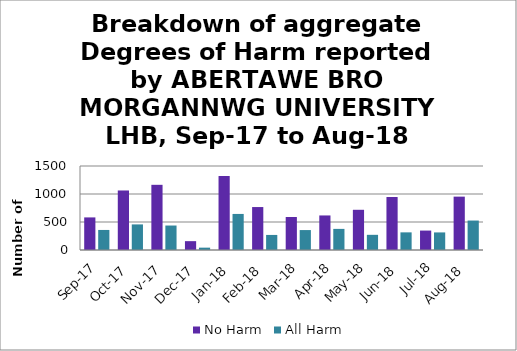
| Category | No Harm | All Harm |
|---|---|---|
| Sep-17 | 582 | 358 |
| Oct-17 | 1063 | 457 |
| Nov-17 | 1164 | 437 |
| Dec-17 | 158 | 42 |
| Jan-18 | 1321 | 644 |
| Feb-18 | 767 | 269 |
| Mar-18 | 589 | 356 |
| Apr-18 | 617 | 377 |
| May-18 | 718 | 271 |
| Jun-18 | 946 | 315 |
| Jul-18 | 347 | 314 |
| Aug-18 | 953 | 526 |